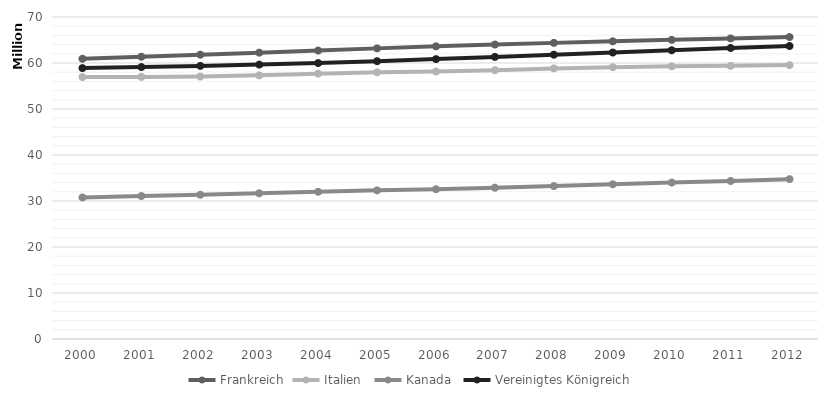
| Category | Frankreich | Italien  | Kanada  | Vereinigtes Königreich  |
|---|---|---|---|---|
| 2000 | 60912498 | 56942108 | 30769700 | 58892514 |
| 2001 | 61357431 | 56974100 | 31081900 | 59119673 |
| 2002 | 61805267 | 57059007 | 31362000 | 59370479 |
| 2003 | 62244884 | 57313203 | 31676000 | 59647577 |
| 2004 | 62704897 | 57685327 | 31995000 | 59987905 |
| 2005 | 63179356 | 57969484 | 32312000 | 60401206 |
| 2006 | 63621376 | 58143979 | 32570505 | 60846820 |
| 2007 | 64016229 | 58438310 | 32887928 | 61322463 |
| 2008 | 64374990 | 58826731 | 33245773 | 61806995 |
| 2009 | 64707044 | 59095365 | 33628571 | 62276270 |
| 2010 | 65027512 | 59277417 | 34005274 | 62766365 |
| 2011 | 65342776 | 59379449 | 34342780 | 63258918 |
| 2012 | 65639975 | 59539717 | 34754312 | 63700300 |